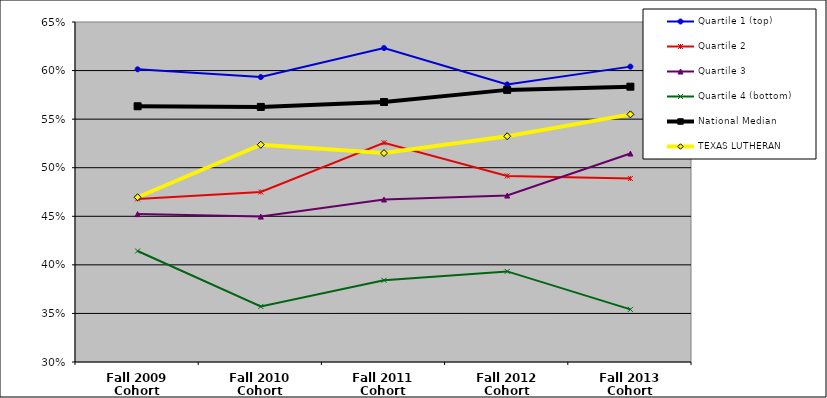
| Category | Quartile 1 (top) | Quartile 2 | Quartile 3 | Quartile 4 (bottom) | National Median | TEXAS LUTHERAN |
|---|---|---|---|---|---|---|
| Fall 2009 Cohort | 0.601 | 0.468 | 0.452 | 0.414 | 0.563 | 0.47 |
| Fall 2010 Cohort | 0.593 | 0.475 | 0.45 | 0.357 | 0.563 | 0.524 |
| Fall 2011 Cohort | 0.623 | 0.526 | 0.467 | 0.384 | 0.568 | 0.515 |
| Fall 2012 Cohort | 0.586 | 0.492 | 0.471 | 0.393 | 0.58 | 0.532 |
| Fall 2013 Cohort | 0.604 | 0.489 | 0.515 | 0.354 | 0.583 | 0.555 |